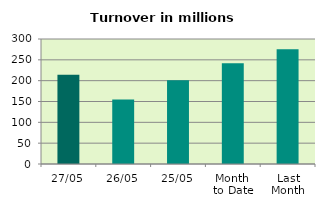
| Category | Series 0 |
|---|---|
| 27/05 | 214.435 |
| 26/05 | 154.698 |
| 25/05 | 201.051 |
| Month 
to Date | 241.522 |
| Last
Month | 275.481 |